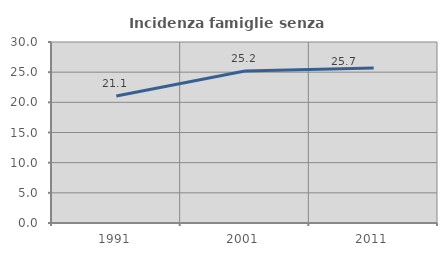
| Category | Incidenza famiglie senza nuclei |
|---|---|
| 1991.0 | 21.053 |
| 2001.0 | 25.205 |
| 2011.0 | 25.683 |